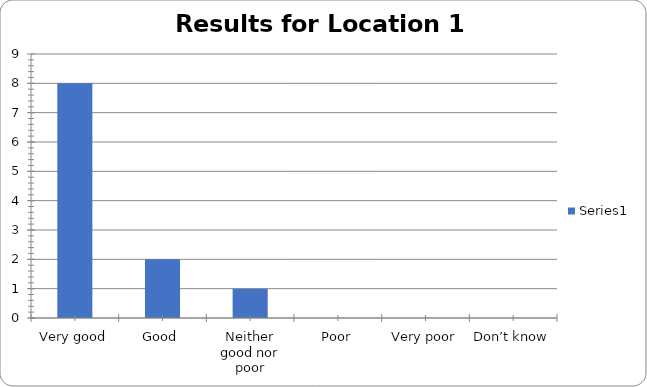
| Category | Series 0 |
|---|---|
| Very good | 8 |
| Good | 2 |
| Neither good nor poor | 1 |
| Poor | 0 |
| Very poor | 0 |
| Don’t know | 0 |